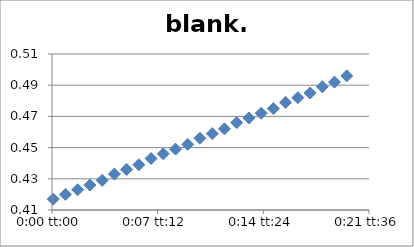
| Category | blank.1 |
|---|---|
| 5.78703703703704e-05 | 0.417 |
| 0.000636574074074074 | 0.42 |
| 0.00121527777777778 | 0.423 |
| 0.00179398148148148 | 0.426 |
| 0.00237268518518518 | 0.429 |
| 0.00295138888888889 | 0.433 |
| 0.00353009259259259 | 0.436 |
| 0.0041087962962963 | 0.439 |
| 0.0046875 | 0.443 |
| 0.0052662037037037 | 0.446 |
| 0.00584490740740741 | 0.449 |
| 0.00642361111111111 | 0.452 |
| 0.00700231481481481 | 0.456 |
| 0.00758101851851852 | 0.459 |
| 0.00815972222222222 | 0.462 |
| 0.00873842592592592 | 0.466 |
| 0.00931712962962963 | 0.469 |
| 0.00989583333333333 | 0.472 |
| 0.010474537037037 | 0.475 |
| 0.0110532407407407 | 0.479 |
| 0.0116319444444444 | 0.482 |
| 0.0122106481481481 | 0.485 |
| 0.0127893518518518 | 0.489 |
| 0.0133680555555556 | 0.492 |
| 0.0139467592592593 | 0.496 |